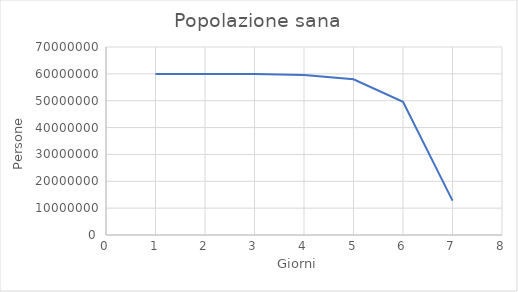
| Category | Series 0 |
|---|---|
| 1.0 | 59982340 |
| 2.0 | 59971339.998 |
| 3.0 | 59912956.299 |
| 4.0 | 59603387.247 |
| 5.0 | 57970392.352 |
| 6.0 | 49591353.463 |
| 7.0 | 12790464.051 |